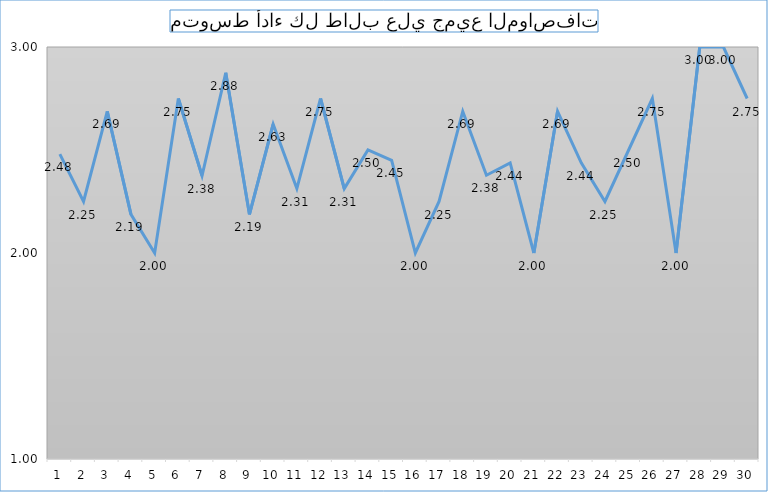
| Category | Series 0 |
|---|---|
| 0 | 2.48 |
| 1 | 2.25 |
| 2 | 2.688 |
| 3 | 2.188 |
| 4 | 2 |
| 5 | 2.75 |
| 6 | 2.375 |
| 7 | 2.875 |
| 8 | 2.188 |
| 9 | 2.625 |
| 10 | 2.312 |
| 11 | 2.75 |
| 12 | 2.312 |
| 13 | 2.5 |
| 14 | 2.449 |
| 15 | 2 |
| 16 | 2.25 |
| 17 | 2.688 |
| 18 | 2.377 |
| 19 | 2.438 |
| 20 | 2 |
| 21 | 2.688 |
| 22 | 2.438 |
| 23 | 2.25 |
| 24 | 2.5 |
| 25 | 2.75 |
| 26 | 2 |
| 27 | 3 |
| 28 | 3 |
| 29 | 2.75 |